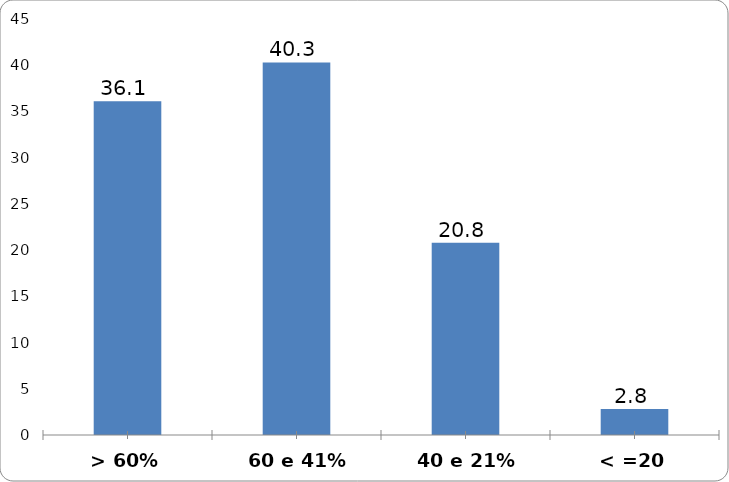
| Category | % |
|---|---|
| > 60% | 36.1 |
| 60 e 41% | 40.3 |
| 40 e 21% | 20.8 |
| < =20 | 2.8 |